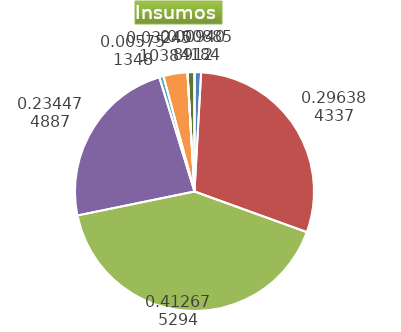
| Category | Series 0 |
|---|---|
| Control arvenses | 759280 |
| Control fitosanitario | 25416085 |
| Cosecha y beneficio | 35388477.163 |
| Fertilización | 20107114 |
| Instalación | 493200 |
| Otros | 2782800 |
| Podas | 0 |
| Riego | 0 |
| Transporte | 806850 |
| Tutorado | 0 |